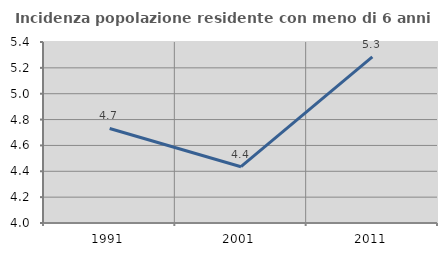
| Category | Incidenza popolazione residente con meno di 6 anni |
|---|---|
| 1991.0 | 4.731 |
| 2001.0 | 4.435 |
| 2011.0 | 5.285 |